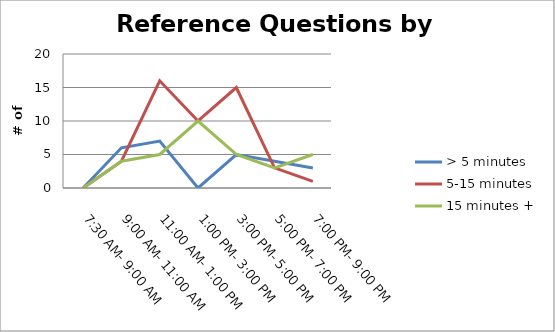
| Category | > 5 minutes | 5-15 minutes | 15 minutes + |
|---|---|---|---|
| 7:30 AM- 9:00 AM | 0 | 0 | 0 |
| 9:00 AM- 11:00 AM | 6 | 4 | 4 |
| 11:00 AM- 1:00 PM | 7 | 16 | 5 |
| 1:00 PM- 3:00 PM | 0 | 10 | 10 |
| 3:00 PM- 5:00 PM | 5 | 15 | 5 |
| 5:00 PM- 7:00 PM | 4 | 3 | 3 |
| 7:00 PM- 9:00 PM | 3 | 1 | 5 |